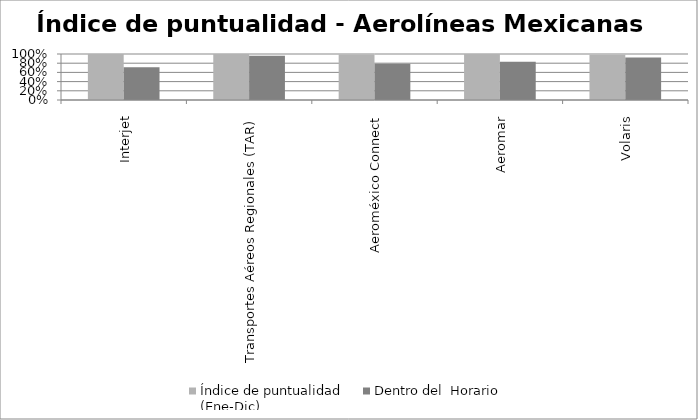
| Category | Índice de puntualidad
(Ene-Dic) | Dentro del  Horario |
|---|---|---|
| Interjet | 1 | 0.712 |
| Transportes Aéreos Regionales (TAR) | 1 | 0.962 |
| Aeroméxico Connect | 0.991 | 0.786 |
| Aeromar | 1 | 0.834 |
| Volaris | 0.986 | 0.926 |